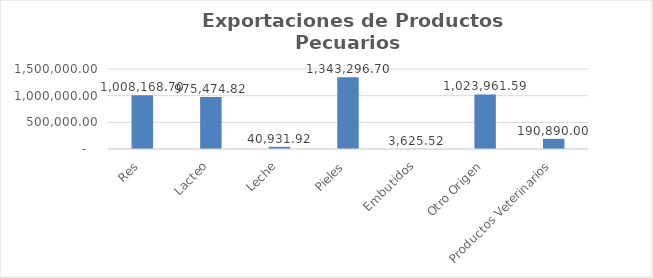
| Category | Valor US$ |
|---|---|
| Res | 1008168.703 |
| Lacteo | 975474.823 |
| Leche | 40931.919 |
| Pieles | 1343296.699 |
| Embutidos | 3625.52 |
| Otro Origen | 1023961.589 |
| Productos Veterinarios | 190890 |